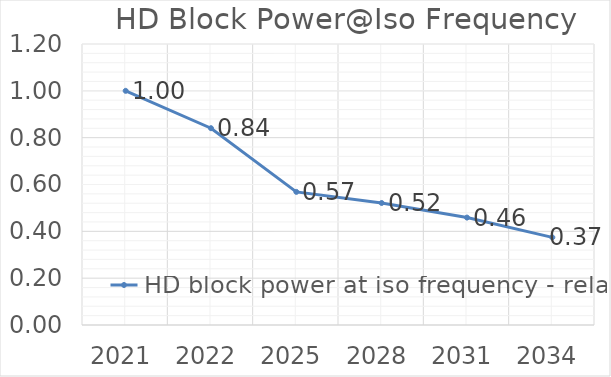
| Category | HD block power at iso frequency - relative |
|---|---|
| 2021.0 | 1 |
| 2022.0 | 0.84 |
| 2025.0 | 0.568 |
| 2028.0 | 0.521 |
| 2031.0 | 0.459 |
| 2034.0 | 0.374 |